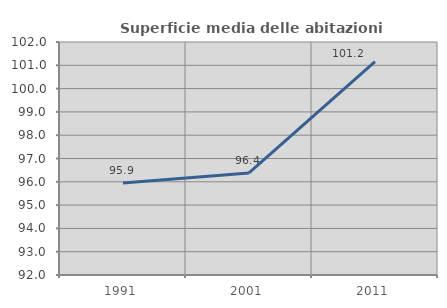
| Category | Superficie media delle abitazioni occupate |
|---|---|
| 1991.0 | 95.949 |
| 2001.0 | 96.383 |
| 2011.0 | 101.159 |